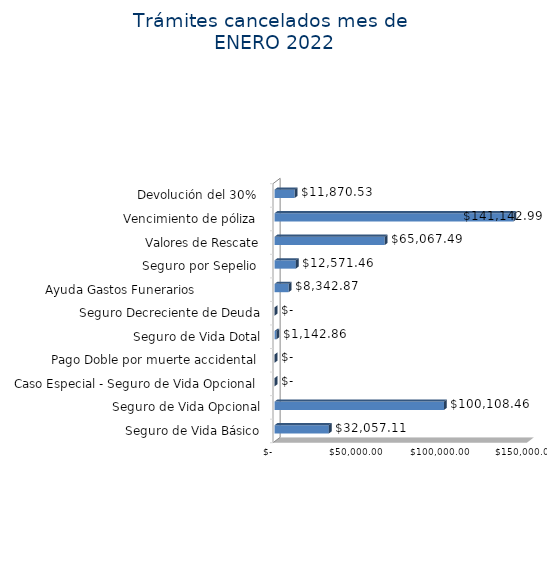
| Category | Monto  |
|---|---|
| Seguro de Vida Básico | 32057.11 |
| Seguro de Vida Opcional | 100108.46 |
| Caso Especial - Seguro de Vida Opcional  | 0 |
| Pago Doble por muerte accidental  | 0 |
| Seguro de Vida Dotal | 1142.86 |
| Seguro Decreciente de Deuda | 0 |
| Ayuda Gastos Funerarios                  | 8342.87 |
| Seguro por Sepelio  | 12571.46 |
| Valores de Rescate | 65067.49 |
| Vencimiento de póliza  | 141142.99 |
| Devolución del 30%  | 11870.53 |